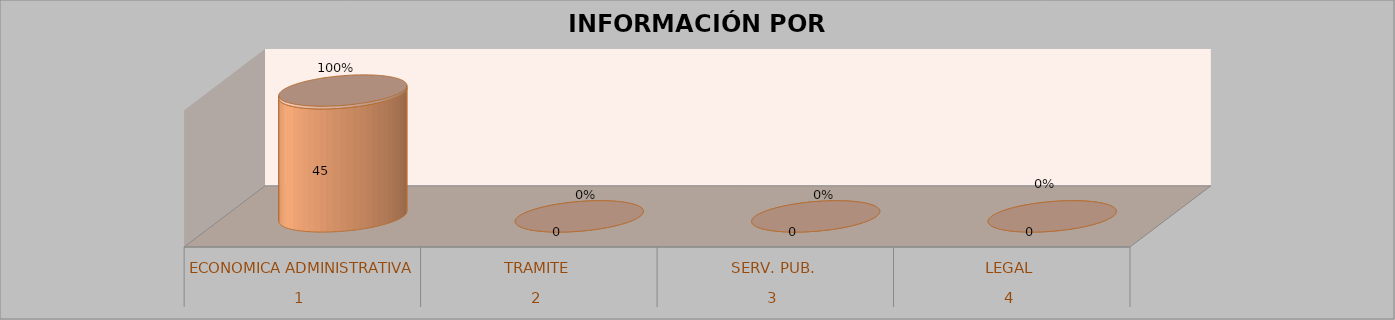
| Category | Series 0 | Series 1 | Series 2 | Series 3 |
|---|---|---|---|---|
| 0 |  |  | 45 | 1 |
| 1 |  |  | 0 | 0 |
| 2 |  |  | 0 | 0 |
| 3 |  |  | 0 | 0 |